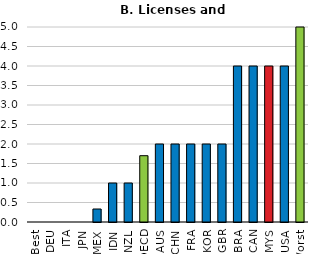
| Category | Series 0 |
|---|---|
| Best | 0 |
| DEU | 0 |
| ITA | 0 |
| JPN | 0 |
| MEX | 0.333 |
| IDN | 1 |
| NZL | 1 |
| OECD | 1.7 |
| AUS | 2 |
| CHN | 2 |
| FRA | 2 |
| KOR | 2 |
| GBR | 2 |
| BRA | 4 |
| CAN | 4 |
| MYS | 4 |
| USA | 4 |
| Worst | 5 |